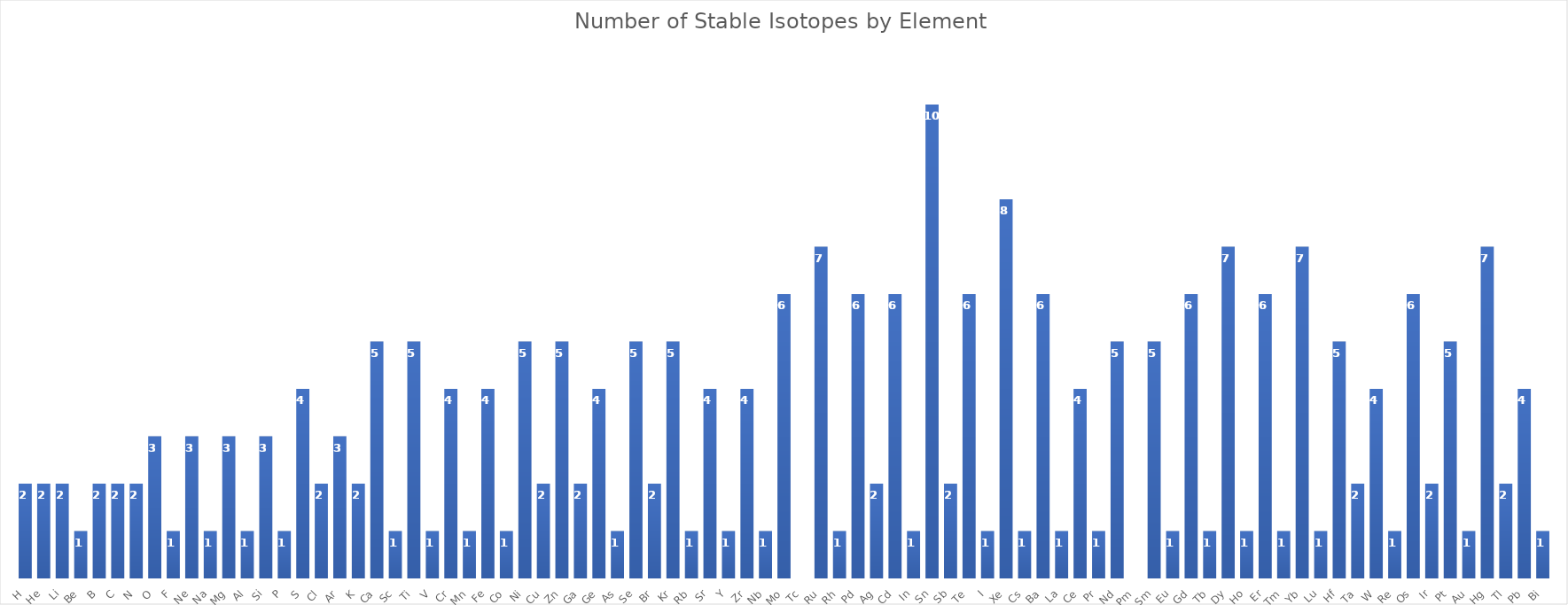
| Category | no Stable Isotopes |
|---|---|
| H | 2 |
| He | 2 |
| Li | 2 |
| Be | 1 |
| B | 2 |
| C | 2 |
| N | 2 |
| O | 3 |
| F | 1 |
| Ne | 3 |
| Na | 1 |
| Mg | 3 |
| Al | 1 |
| Si | 3 |
| P | 1 |
| S | 4 |
| Cl | 2 |
| Ar | 3 |
| K | 2 |
| Ca | 5 |
| Sc | 1 |
| Ti | 5 |
| V | 1 |
| Cr | 4 |
| Mn | 1 |
| Fe | 4 |
| Co | 1 |
| Ni | 5 |
| Cu | 2 |
| Zn | 5 |
| Ga | 2 |
| Ge | 4 |
| As | 1 |
| Se | 5 |
| Br | 2 |
| Kr | 5 |
| Rb | 1 |
| Sr | 4 |
| Y | 1 |
| Zr | 4 |
| Nb | 1 |
| Mo | 6 |
| Tc | 0 |
| Ru | 7 |
| Rh | 1 |
| Pd | 6 |
| Ag | 2 |
| Cd | 6 |
| In | 1 |
| Sn | 10 |
| Sb | 2 |
| Te | 6 |
| I | 1 |
| Xe | 8 |
| Cs | 1 |
| Ba | 6 |
| La | 1 |
| Ce | 4 |
| Pr | 1 |
| Nd | 5 |
| Pm | 0 |
| Sm | 5 |
| Eu | 1 |
| Gd | 6 |
| Tb | 1 |
| Dy | 7 |
| Ho | 1 |
| Er | 6 |
| Tm | 1 |
| Yb | 7 |
| Lu | 1 |
| Hf | 5 |
| Ta | 2 |
| W | 4 |
| Re | 1 |
| Os | 6 |
| Ir | 2 |
| Pt | 5 |
| Au | 1 |
| Hg | 7 |
| Tl | 2 |
| Pb | 4 |
| Bi | 1 |